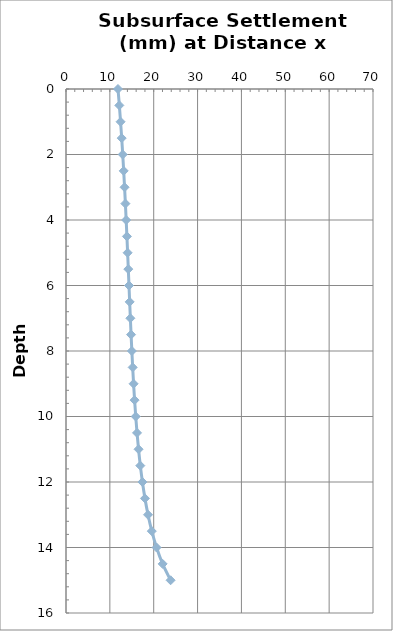
| Category | Series 0 |
|---|---|
| 11.856410810810813 | 0 |
| 12.162745995437342 | 0.5 |
| 12.442884339795103 | 1 |
| 12.699672279101915 | 1.5 |
| 12.935752349704464 | 2 |
| 13.153608769925317 | 2.5 |
| 13.355608270467355 | 3 |
| 13.54403765504382 | 3.5 |
| 13.721139448800173 | 4 |
| 13.889146948243907 | 4.5 |
| 14.050320022441698 | 5 |
| 14.206983139506344 | 5.5 |
| 14.36156732254895 | 6 |
| 14.516658105469242 | 6.5 |
| 14.675052109193846 | 7 |
| 14.839825667925103 | 7.5 |
| 15.014420118550076 | 8 |
| 15.20275010595224 | 8.5 |
| 15.409343840307908 | 9 |
| 15.639528134227799 | 9.5 |
| 15.899677014101421 | 10 |
| 16.197552035064405 | 10.5 |
| 16.542777375925063 | 11 |
| 16.947517355548612 | 11.5 |
| 17.427465592466717 | 12 |
| 18.003327802547684 | 12.5 |
| 18.703112551140446 | 13 |
| 19.565795693471053 | 13.5 |
| 20.647427077762305 | 14 |
| 22.03181662769424 | 14.5 |
| 23.85037930839516 | 15 |